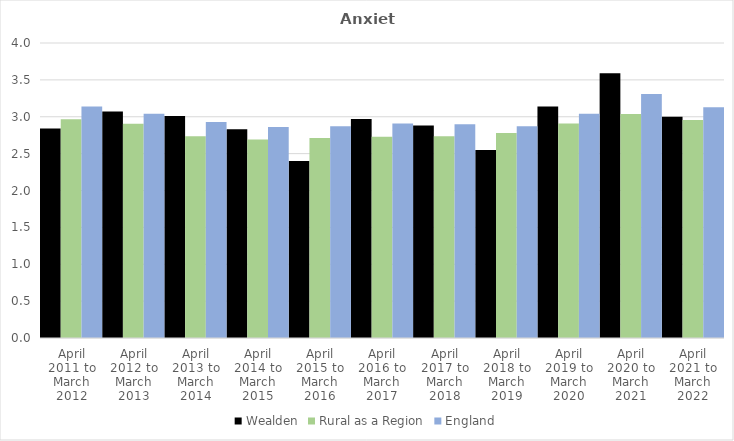
| Category | Wealden | Rural as a Region | England |
|---|---|---|---|
| April 2011 to March 2012 | 2.84 | 2.967 | 3.14 |
| April 2012 to March 2013 | 3.07 | 2.904 | 3.04 |
| April 2013 to March 2014 | 3.01 | 2.734 | 2.93 |
| April 2014 to March 2015 | 2.83 | 2.691 | 2.86 |
| April 2015 to March 2016 | 2.4 | 2.711 | 2.87 |
| April 2016 to March 2017 | 2.97 | 2.729 | 2.91 |
| April 2017 to March 2018 | 2.88 | 2.736 | 2.9 |
| April 2018 to March 2019 | 2.55 | 2.78 | 2.87 |
| April 2019 to March 2020 | 3.14 | 2.908 | 3.04 |
| April 2020 to March 2021 | 3.59 | 3.036 | 3.31 |
| April 2021 to March 2022 | 3 | 2.956 | 3.13 |